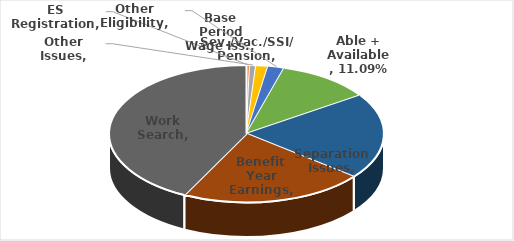
| Category | Series 0 |
|---|---|
| Sev./Vac./SSI/ Pension | 0 |
| ES Registration | 0.004 |
| Other Issues | 0.007 |
| Base Period Wage Iss. | 0.014 |
| Other Eligibility | 0.019 |
| Able + Available | 0.111 |
| Separation Issues | 0.202 |
| Benefit Year Earnings | 0.217 |
| Work Search | 0.426 |